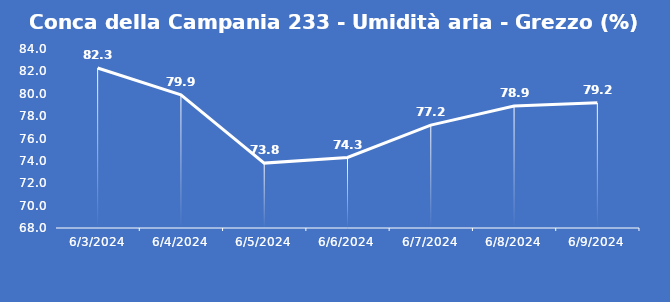
| Category | Conca della Campania 233 - Umidità aria - Grezzo (%) |
|---|---|
| 6/3/24 | 82.3 |
| 6/4/24 | 79.9 |
| 6/5/24 | 73.8 |
| 6/6/24 | 74.3 |
| 6/7/24 | 77.2 |
| 6/8/24 | 78.9 |
| 6/9/24 | 79.2 |